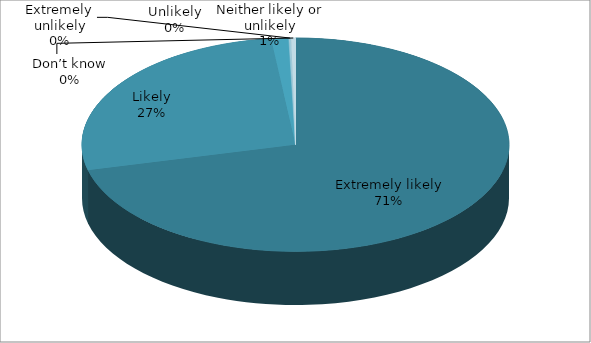
| Category | TOTAL |
|---|---|
| Extremely likely | 427 |
| Likely | 162 |
| Neither likely or unlikely | 8 |
| Unlikely | 0 |
| Extremely unlikely | 1 |
| Don’t know | 2 |